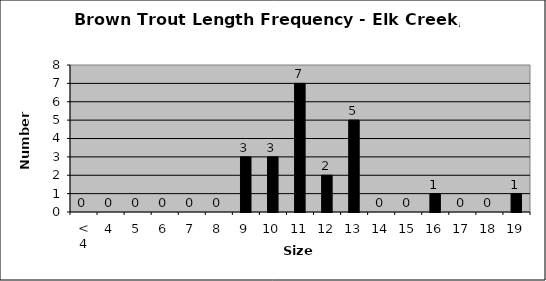
| Category | Series 0 |
|---|---|
| < 4 | 0 |
| 4 | 0 |
| 5 | 0 |
| 6 | 0 |
| 7 | 0 |
| 8 | 0 |
| 9 | 3 |
| 10 | 3 |
| 11 | 7 |
| 12 | 2 |
| 13 | 5 |
| 14 | 0 |
| 15 | 0 |
| 16 | 1 |
| 17 | 0 |
| 18 | 0 |
| 19 | 1 |